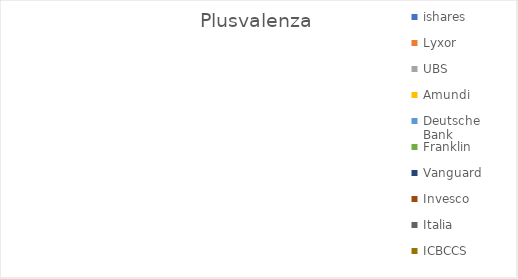
| Category | Plusvalenza |
|---|---|
| ishares | 0 |
| Lyxor | 0 |
| UBS | 0 |
| Amundi | 0 |
| Deutsche Bank | 0 |
| Franklin | 0 |
| Vanguard | 0 |
| Invesco | 0 |
| Italia | 0 |
| ICBCCS | 0 |